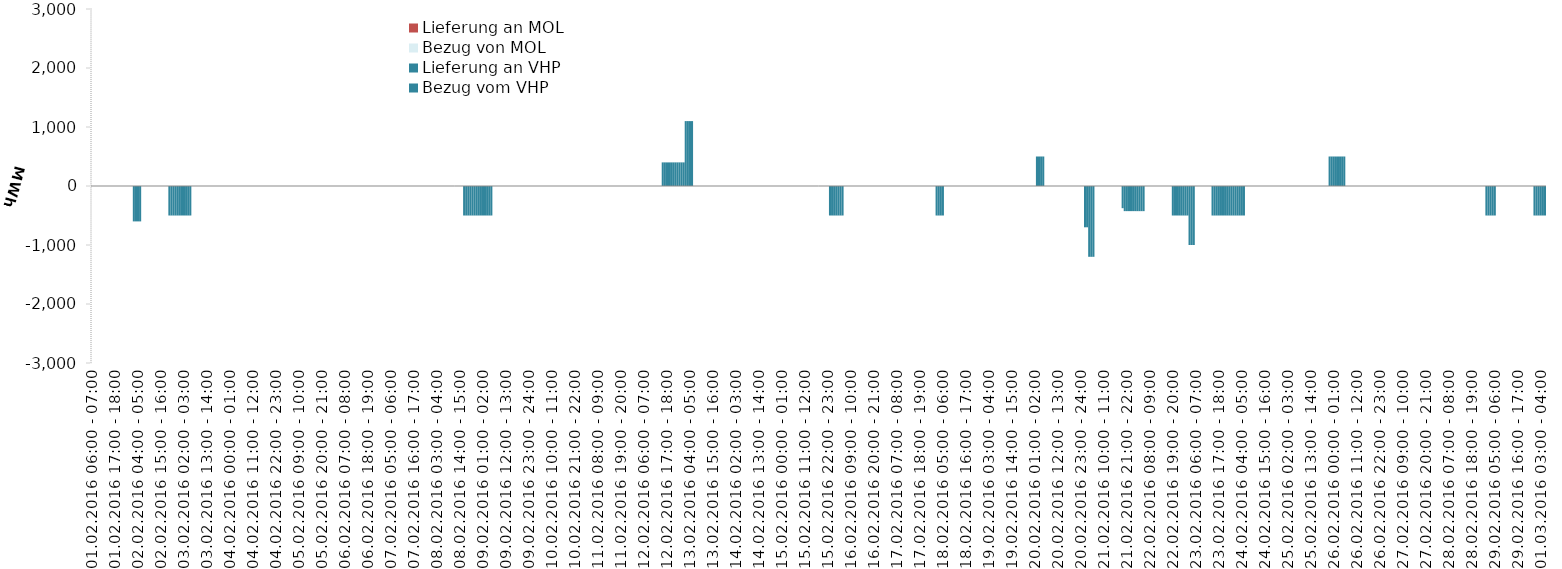
| Category | Bezug vom VHP | Lieferung an VHP | Bezug von MOL | Lieferung an MOL |
|---|---|---|---|---|
| 01.02.2016 06:00 - 07:00 | 0 | 0 | 0 | 0 |
| 01.02.2016 07:00 - 08:00 | 0 | 0 | 0 | 0 |
| 01.02.2016 08:00 - 09:00 | 0 | 0 | 0 | 0 |
| 01.02.2016 09:00 - 10:00 | 0 | 0 | 0 | 0 |
| 01.02.2016 10:00 - 11:00 | 0 | 0 | 0 | 0 |
| 01.02.2016 11:00 - 12:00 | 0 | 0 | 0 | 0 |
| 01.02.2016 12:00 - 13:00 | 0 | 0 | 0 | 0 |
| 01.02.2016 13:00 - 14:00 | 0 | 0 | 0 | 0 |
| 01.02.2016 14:00 - 15:00 | 0 | 0 | 0 | 0 |
| 01.02.2016 15:00 - 16:00 | 0 | 0 | 0 | 0 |
| 01.02.2016 16:00 - 17:00 | 0 | 0 | 0 | 0 |
| 01.02.2016 17:00 - 18:00 | 0 | 0 | 0 | 0 |
| 01.02.2016 18:00 - 19:00 | 0 | 0 | 0 | 0 |
| 01.02.2016 19:00 - 20:00 | 0 | 0 | 0 | 0 |
| 01.02.2016 20:00 - 21:00 | 0 | 0 | 0 | 0 |
| 01.02.2016 21:00 - 22:00 | 0 | 0 | 0 | 0 |
| 01.02.2016 22:00 - 23:00 | 0 | 0 | 0 | 0 |
| 01.02.2016 23:00 - 24:00 | 0 | 0 | 0 | 0 |
| 02.02.2016 00:00 - 01:00 | 0 | 0 | 0 | 0 |
| 02.02.2016 01:00 - 02:00 | 0 | 0 | 0 | 0 |
| 02.02.2016 02:00 - 03:00 | 0 | -600 | 0 | 0 |
| 02.02.2016 03:00 - 04:00 | 0 | -600 | 0 | 0 |
| 02.02.2016 04:00 - 05:00 | 0 | -600 | 0 | 0 |
| 02.02.2016 05:00 - 06:00 | 0 | -600 | 0 | 0 |
| 02.02.2016 06:00 - 07:00 | 0 | 0 | 0 | 0 |
| 02.02.2016 07:00 - 08:00 | 0 | 0 | 0 | 0 |
| 02.02.2016 08:00 - 09:00 | 0 | 0 | 0 | 0 |
| 02.02.2016 09:00 - 10:00 | 0 | 0 | 0 | 0 |
| 02.02.2016 10:00 - 11:00 | 0 | 0 | 0 | 0 |
| 02.02.2016 11:00 - 12:00 | 0 | 0 | 0 | 0 |
| 02.02.2016 12:00 - 13:00 | 0 | 0 | 0 | 0 |
| 02.02.2016 13:00 - 14:00 | 0 | 0 | 0 | 0 |
| 02.02.2016 14:00 - 15:00 | 0 | 0 | 0 | 0 |
| 02.02.2016 15:00 - 16:00 | 0 | 0 | 0 | 0 |
| 02.02.2016 16:00 - 17:00 | 0 | 0 | 0 | 0 |
| 02.02.2016 17:00 - 18:00 | 0 | 0 | 0 | 0 |
| 02.02.2016 18:00 - 19:00 | 0 | 0 | 0 | 0 |
| 02.02.2016 19:00 - 20:00 | 0 | -500 | 0 | 0 |
| 02.02.2016 20:00 - 21:00 | 0 | -500 | 0 | 0 |
| 02.02.2016 21:00 - 22:00 | 0 | -500 | 0 | 0 |
| 02.02.2016 22:00 - 23:00 | 0 | -500 | 0 | 0 |
| 02.02.2016 23:00 - 24:00 | 0 | -500 | 0 | 0 |
| 03.02.2016 00:00 - 01:00 | 0 | -500 | 0 | 0 |
| 03.02.2016 01:00 - 02:00 | 0 | -500 | 0 | 0 |
| 03.02.2016 02:00 - 03:00 | 0 | -500 | 0 | 0 |
| 03.02.2016 03:00 - 04:00 | 0 | -500 | 0 | 0 |
| 03.02.2016 04:00 - 05:00 | 0 | -500 | 0 | 0 |
| 03.02.2016 05:00 - 06:00 | 0 | -500 | 0 | 0 |
| 03.02.2016 06:00 - 07:00 | 0 | 0 | 0 | 0 |
| 03.02.2016 07:00 - 08:00 | 0 | 0 | 0 | 0 |
| 03.02.2016 08:00 - 09:00 | 0 | 0 | 0 | 0 |
| 03.02.2016 09:00 - 10:00 | 0 | 0 | 0 | 0 |
| 03.02.2016 10:00 - 11:00 | 0 | 0 | 0 | 0 |
| 03.02.2016 11:00 - 12:00 | 0 | 0 | 0 | 0 |
| 03.02.2016 12:00 - 13:00 | 0 | 0 | 0 | 0 |
| 03.02.2016 13:00 - 14:00 | 0 | 0 | 0 | 0 |
| 03.02.2016 14:00 - 15:00 | 0 | 0 | 0 | 0 |
| 03.02.2016 15:00 - 16:00 | 0 | 0 | 0 | 0 |
| 03.02.2016 16:00 - 17:00 | 0 | 0 | 0 | 0 |
| 03.02.2016 17:00 - 18:00 | 0 | 0 | 0 | 0 |
| 03.02.2016 18:00 - 19:00 | 0 | 0 | 0 | 0 |
| 03.02.2016 19:00 - 20:00 | 0 | 0 | 0 | 0 |
| 03.02.2016 20:00 - 21:00 | 0 | 0 | 0 | 0 |
| 03.02.2016 21:00 - 22:00 | 0 | 0 | 0 | 0 |
| 03.02.2016 22:00 - 23:00 | 0 | 0 | 0 | 0 |
| 03.02.2016 23:00 - 24:00 | 0 | 0 | 0 | 0 |
| 04.02.2016 00:00 - 01:00 | 0 | 0 | 0 | 0 |
| 04.02.2016 01:00 - 02:00 | 0 | 0 | 0 | 0 |
| 04.02.2016 02:00 - 03:00 | 0 | 0 | 0 | 0 |
| 04.02.2016 03:00 - 04:00 | 0 | 0 | 0 | 0 |
| 04.02.2016 04:00 - 05:00 | 0 | 0 | 0 | 0 |
| 04.02.2016 05:00 - 06:00 | 0 | 0 | 0 | 0 |
| 04.02.2016 06:00 - 07:00 | 0 | 0 | 0 | 0 |
| 04.02.2016 07:00 - 08:00 | 0 | 0 | 0 | 0 |
| 04.02.2016 08:00 - 09:00 | 0 | 0 | 0 | 0 |
| 04.02.2016 09:00 - 10:00 | 0 | 0 | 0 | 0 |
| 04.02.2016 10:00 - 11:00 | 0 | 0 | 0 | 0 |
| 04.02.2016 11:00 - 12:00 | 0 | 0 | 0 | 0 |
| 04.02.2016 12:00 - 13:00 | 0 | 0 | 0 | 0 |
| 04.02.2016 13:00 - 14:00 | 0 | 0 | 0 | 0 |
| 04.02.2016 14:00 - 15:00 | 0 | 0 | 0 | 0 |
| 04.02.2016 15:00 - 16:00 | 0 | 0 | 0 | 0 |
| 04.02.2016 16:00 - 17:00 | 0 | 0 | 0 | 0 |
| 04.02.2016 17:00 - 18:00 | 0 | 0 | 0 | 0 |
| 04.02.2016 18:00 - 19:00 | 0 | 0 | 0 | 0 |
| 04.02.2016 19:00 - 20:00 | 0 | 0 | 0 | 0 |
| 04.02.2016 20:00 - 21:00 | 0 | 0 | 0 | 0 |
| 04.02.2016 21:00 - 22:00 | 0 | 0 | 0 | 0 |
| 04.02.2016 22:00 - 23:00 | 0 | 0 | 0 | 0 |
| 04.02.2016 23:00 - 24:00 | 0 | 0 | 0 | 0 |
| 05.02.2016 00:00 - 01:00 | 0 | 0 | 0 | 0 |
| 05.02.2016 01:00 - 02:00 | 0 | 0 | 0 | 0 |
| 05.02.2016 02:00 - 03:00 | 0 | 0 | 0 | 0 |
| 05.02.2016 03:00 - 04:00 | 0 | 0 | 0 | 0 |
| 05.02.2016 04:00 - 05:00 | 0 | 0 | 0 | 0 |
| 05.02.2016 05:00 - 06:00 | 0 | 0 | 0 | 0 |
| 05.02.2016 06:00 - 07:00 | 0 | 0 | 0 | 0 |
| 05.02.2016 07:00 - 08:00 | 0 | 0 | 0 | 0 |
| 05.02.2016 08:00 - 09:00 | 0 | 0 | 0 | 0 |
| 05.02.2016 09:00 - 10:00 | 0 | 0 | 0 | 0 |
| 05.02.2016 10:00 - 11:00 | 0 | 0 | 0 | 0 |
| 05.02.2016 11:00 - 12:00 | 0 | 0 | 0 | 0 |
| 05.02.2016 12:00 - 13:00 | 0 | 0 | 0 | 0 |
| 05.02.2016 13:00 - 14:00 | 0 | 0 | 0 | 0 |
| 05.02.2016 14:00 - 15:00 | 0 | 0 | 0 | 0 |
| 05.02.2016 15:00 - 16:00 | 0 | 0 | 0 | 0 |
| 05.02.2016 16:00 - 17:00 | 0 | 0 | 0 | 0 |
| 05.02.2016 17:00 - 18:00 | 0 | 0 | 0 | 0 |
| 05.02.2016 18:00 - 19:00 | 0 | 0 | 0 | 0 |
| 05.02.2016 19:00 - 20:00 | 0 | 0 | 0 | 0 |
| 05.02.2016 20:00 - 21:00 | 0 | 0 | 0 | 0 |
| 05.02.2016 21:00 - 22:00 | 0 | 0 | 0 | 0 |
| 05.02.2016 22:00 - 23:00 | 0 | 0 | 0 | 0 |
| 05.02.2016 23:00 - 24:00 | 0 | 0 | 0 | 0 |
| 06.02.2016 00:00 - 01:00 | 0 | 0 | 0 | 0 |
| 06.02.2016 01:00 - 02:00 | 0 | 0 | 0 | 0 |
| 06.02.2016 02:00 - 03:00 | 0 | 0 | 0 | 0 |
| 06.02.2016 03:00 - 04:00 | 0 | 0 | 0 | 0 |
| 06.02.2016 04:00 - 05:00 | 0 | 0 | 0 | 0 |
| 06.02.2016 05:00 - 06:00 | 0 | 0 | 0 | 0 |
| 06.02.2016 06:00 - 07:00 | 0 | 0 | 0 | 0 |
| 06.02.2016 07:00 - 08:00 | 0 | 0 | 0 | 0 |
| 06.02.2016 08:00 - 09:00 | 0 | 0 | 0 | 0 |
| 06.02.2016 09:00 - 10:00 | 0 | 0 | 0 | 0 |
| 06.02.2016 10:00 - 11:00 | 0 | 0 | 0 | 0 |
| 06.02.2016 11:00 - 12:00 | 0 | 0 | 0 | 0 |
| 06.02.2016 12:00 - 13:00 | 0 | 0 | 0 | 0 |
| 06.02.2016 13:00 - 14:00 | 0 | 0 | 0 | 0 |
| 06.02.2016 14:00 - 15:00 | 0 | 0 | 0 | 0 |
| 06.02.2016 15:00 - 16:00 | 0 | 0 | 0 | 0 |
| 06.02.2016 16:00 - 17:00 | 0 | 0 | 0 | 0 |
| 06.02.2016 17:00 - 18:00 | 0 | 0 | 0 | 0 |
| 06.02.2016 18:00 - 19:00 | 0 | 0 | 0 | 0 |
| 06.02.2016 19:00 - 20:00 | 0 | 0 | 0 | 0 |
| 06.02.2016 20:00 - 21:00 | 0 | 0 | 0 | 0 |
| 06.02.2016 21:00 - 22:00 | 0 | 0 | 0 | 0 |
| 06.02.2016 22:00 - 23:00 | 0 | 0 | 0 | 0 |
| 06.02.2016 23:00 - 24:00 | 0 | 0 | 0 | 0 |
| 07.02.2016 00:00 - 01:00 | 0 | 0 | 0 | 0 |
| 07.02.2016 01:00 - 02:00 | 0 | 0 | 0 | 0 |
| 07.02.2016 02:00 - 03:00 | 0 | 0 | 0 | 0 |
| 07.02.2016 03:00 - 04:00 | 0 | 0 | 0 | 0 |
| 07.02.2016 04:00 - 05:00 | 0 | 0 | 0 | 0 |
| 07.02.2016 05:00 - 06:00 | 0 | 0 | 0 | 0 |
| 07.02.2016 06:00 - 07:00 | 0 | 0 | 0 | 0 |
| 07.02.2016 07:00 - 08:00 | 0 | 0 | 0 | 0 |
| 07.02.2016 08:00 - 09:00 | 0 | 0 | 0 | 0 |
| 07.02.2016 09:00 - 10:00 | 0 | 0 | 0 | 0 |
| 07.02.2016 10:00 - 11:00 | 0 | 0 | 0 | 0 |
| 07.02.2016 11:00 - 12:00 | 0 | 0 | 0 | 0 |
| 07.02.2016 12:00 - 13:00 | 0 | 0 | 0 | 0 |
| 07.02.2016 13:00 - 14:00 | 0 | 0 | 0 | 0 |
| 07.02.2016 14:00 - 15:00 | 0 | 0 | 0 | 0 |
| 07.02.2016 15:00 - 16:00 | 0 | 0 | 0 | 0 |
| 07.02.2016 16:00 - 17:00 | 0 | 0 | 0 | 0 |
| 07.02.2016 17:00 - 18:00 | 0 | 0 | 0 | 0 |
| 07.02.2016 18:00 - 19:00 | 0 | 0 | 0 | 0 |
| 07.02.2016 19:00 - 20:00 | 0 | 0 | 0 | 0 |
| 07.02.2016 20:00 - 21:00 | 0 | 0 | 0 | 0 |
| 07.02.2016 21:00 - 22:00 | 0 | 0 | 0 | 0 |
| 07.02.2016 22:00 - 23:00 | 0 | 0 | 0 | 0 |
| 07.02.2016 23:00 - 24:00 | 0 | 0 | 0 | 0 |
| 08.02.2016 00:00 - 01:00 | 0 | 0 | 0 | 0 |
| 08.02.2016 01:00 - 02:00 | 0 | 0 | 0 | 0 |
| 08.02.2016 02:00 - 03:00 | 0 | 0 | 0 | 0 |
| 08.02.2016 03:00 - 04:00 | 0 | 0 | 0 | 0 |
| 08.02.2016 04:00 - 05:00 | 0 | 0 | 0 | 0 |
| 08.02.2016 05:00 - 06:00 | 0 | 0 | 0 | 0 |
| 08.02.2016 06:00 - 07:00 | 0 | 0 | 0 | 0 |
| 08.02.2016 07:00 - 08:00 | 0 | 0 | 0 | 0 |
| 08.02.2016 08:00 - 09:00 | 0 | 0 | 0 | 0 |
| 08.02.2016 09:00 - 10:00 | 0 | 0 | 0 | 0 |
| 08.02.2016 10:00 - 11:00 | 0 | 0 | 0 | 0 |
| 08.02.2016 11:00 - 12:00 | 0 | 0 | 0 | 0 |
| 08.02.2016 12:00 - 13:00 | 0 | 0 | 0 | 0 |
| 08.02.2016 13:00 - 14:00 | 0 | 0 | 0 | 0 |
| 08.02.2016 14:00 - 15:00 | 0 | 0 | 0 | 0 |
| 08.02.2016 15:00 - 16:00 | 0 | 0 | 0 | 0 |
| 08.02.2016 16:00 - 17:00 | 0 | -500 | 0 | 0 |
| 08.02.2016 17:00 - 18:00 | 0 | -500 | 0 | 0 |
| 08.02.2016 18:00 - 19:00 | 0 | -500 | 0 | 0 |
| 08.02.2016 19:00 - 20:00 | 0 | -500 | 0 | 0 |
| 08.02.2016 20:00 - 21:00 | 0 | -500 | 0 | 0 |
| 08.02.2016 21:00 - 22:00 | 0 | -500 | 0 | 0 |
| 08.02.2016 22:00 - 23:00 | 0 | -500 | 0 | 0 |
| 08.02.2016 23:00 - 24:00 | 0 | -500 | 0 | 0 |
| 09.02.2016 00:00 - 01:00 | 0 | -500 | 0 | 0 |
| 09.02.2016 01:00 - 02:00 | 0 | -500 | 0 | 0 |
| 09.02.2016 02:00 - 03:00 | 0 | -500 | 0 | 0 |
| 09.02.2016 03:00 - 04:00 | 0 | -500 | 0 | 0 |
| 09.02.2016 04:00 - 05:00 | 0 | -500 | 0 | 0 |
| 09.02.2016 05:00 - 06:00 | 0 | -500 | 0 | 0 |
| 09.02.2016 06:00 - 07:00 | 0 | 0 | 0 | 0 |
| 09.02.2016 07:00 - 08:00 | 0 | 0 | 0 | 0 |
| 09.02.2016 08:00 - 09:00 | 0 | 0 | 0 | 0 |
| 09.02.2016 09:00 - 10:00 | 0 | 0 | 0 | 0 |
| 09.02.2016 10:00 - 11:00 | 0 | 0 | 0 | 0 |
| 09.02.2016 11:00 - 12:00 | 0 | 0 | 0 | 0 |
| 09.02.2016 12:00 - 13:00 | 0 | 0 | 0 | 0 |
| 09.02.2016 13:00 - 14:00 | 0 | 0 | 0 | 0 |
| 09.02.2016 14:00 - 15:00 | 0 | 0 | 0 | 0 |
| 09.02.2016 15:00 - 16:00 | 0 | 0 | 0 | 0 |
| 09.02.2016 16:00 - 17:00 | 0 | 0 | 0 | 0 |
| 09.02.2016 17:00 - 18:00 | 0 | 0 | 0 | 0 |
| 09.02.2016 18:00 - 19:00 | 0 | 0 | 0 | 0 |
| 09.02.2016 19:00 - 20:00 | 0 | 0 | 0 | 0 |
| 09.02.2016 20:00 - 21:00 | 0 | 0 | 0 | 0 |
| 09.02.2016 21:00 - 22:00 | 0 | 0 | 0 | 0 |
| 09.02.2016 22:00 - 23:00 | 0 | 0 | 0 | 0 |
| 09.02.2016 23:00 - 24:00 | 0 | 0 | 0 | 0 |
| 10.02.2016 00:00 - 01:00 | 0 | 0 | 0 | 0 |
| 10.02.2016 01:00 - 02:00 | 0 | 0 | 0 | 0 |
| 10.02.2016 02:00 - 03:00 | 0 | 0 | 0 | 0 |
| 10.02.2016 03:00 - 04:00 | 0 | 0 | 0 | 0 |
| 10.02.2016 04:00 - 05:00 | 0 | 0 | 0 | 0 |
| 10.02.2016 05:00 - 06:00 | 0 | 0 | 0 | 0 |
| 10.02.2016 06:00 - 07:00 | 0 | 0 | 0 | 0 |
| 10.02.2016 07:00 - 08:00 | 0 | 0 | 0 | 0 |
| 10.02.2016 08:00 - 09:00 | 0 | 0 | 0 | 0 |
| 10.02.2016 09:00 - 10:00 | 0 | 0 | 0 | 0 |
| 10.02.2016 10:00 - 11:00 | 0 | 0 | 0 | 0 |
| 10.02.2016 11:00 - 12:00 | 0 | 0 | 0 | 0 |
| 10.02.2016 12:00 - 13:00 | 0 | 0 | 0 | 0 |
| 10.02.2016 13:00 - 14:00 | 0 | 0 | 0 | 0 |
| 10.02.2016 14:00 - 15:00 | 0 | 0 | 0 | 0 |
| 10.02.2016 15:00 - 16:00 | 0 | 0 | 0 | 0 |
| 10.02.2016 16:00 - 17:00 | 0 | 0 | 0 | 0 |
| 10.02.2016 17:00 - 18:00 | 0 | 0 | 0 | 0 |
| 10.02.2016 18:00 - 19:00 | 0 | 0 | 0 | 0 |
| 10.02.2016 19:00 - 20:00 | 0 | 0 | 0 | 0 |
| 10.02.2016 20:00 - 21:00 | 0 | 0 | 0 | 0 |
| 10.02.2016 21:00 - 22:00 | 0 | 0 | 0 | 0 |
| 10.02.2016 22:00 - 23:00 | 0 | 0 | 0 | 0 |
| 10.02.2016 23:00 - 24:00 | 0 | 0 | 0 | 0 |
| 11.02.2016 00:00 - 01:00 | 0 | 0 | 0 | 0 |
| 11.02.2016 01:00 - 02:00 | 0 | 0 | 0 | 0 |
| 11.02.2016 02:00 - 03:00 | 0 | 0 | 0 | 0 |
| 11.02.2016 03:00 - 04:00 | 0 | 0 | 0 | 0 |
| 11.02.2016 04:00 - 05:00 | 0 | 0 | 0 | 0 |
| 11.02.2016 05:00 - 06:00 | 0 | 0 | 0 | 0 |
| 11.02.2016 06:00 - 07:00 | 0 | 0 | 0 | 0 |
| 11.02.2016 07:00 - 08:00 | 0 | 0 | 0 | 0 |
| 11.02.2016 08:00 - 09:00 | 0 | 0 | 0 | 0 |
| 11.02.2016 09:00 - 10:00 | 0 | 0 | 0 | 0 |
| 11.02.2016 10:00 - 11:00 | 0 | 0 | 0 | 0 |
| 11.02.2016 11:00 - 12:00 | 0 | 0 | 0 | 0 |
| 11.02.2016 12:00 - 13:00 | 0 | 0 | 0 | 0 |
| 11.02.2016 13:00 - 14:00 | 0 | 0 | 0 | 0 |
| 11.02.2016 14:00 - 15:00 | 0 | 0 | 0 | 0 |
| 11.02.2016 15:00 - 16:00 | 0 | 0 | 0 | 0 |
| 11.02.2016 16:00 - 17:00 | 0 | 0 | 0 | 0 |
| 11.02.2016 17:00 - 18:00 | 0 | 0 | 0 | 0 |
| 11.02.2016 18:00 - 19:00 | 0 | 0 | 0 | 0 |
| 11.02.2016 19:00 - 20:00 | 0 | 0 | 0 | 0 |
| 11.02.2016 20:00 - 21:00 | 0 | 0 | 0 | 0 |
| 11.02.2016 21:00 - 22:00 | 0 | 0 | 0 | 0 |
| 11.02.2016 22:00 - 23:00 | 0 | 0 | 0 | 0 |
| 11.02.2016 23:00 - 24:00 | 0 | 0 | 0 | 0 |
| 12.02.2016 00:00 - 01:00 | 0 | 0 | 0 | 0 |
| 12.02.2016 01:00 - 02:00 | 0 | 0 | 0 | 0 |
| 12.02.2016 02:00 - 03:00 | 0 | 0 | 0 | 0 |
| 12.02.2016 03:00 - 04:00 | 0 | 0 | 0 | 0 |
| 12.02.2016 04:00 - 05:00 | 0 | 0 | 0 | 0 |
| 12.02.2016 05:00 - 06:00 | 0 | 0 | 0 | 0 |
| 12.02.2016 06:00 - 07:00 | 0 | 0 | 0 | 0 |
| 12.02.2016 07:00 - 08:00 | 0 | 0 | 0 | 0 |
| 12.02.2016 08:00 - 09:00 | 0 | 0 | 0 | 0 |
| 12.02.2016 09:00 - 10:00 | 0 | 0 | 0 | 0 |
| 12.02.2016 10:00 - 11:00 | 0 | 0 | 0 | 0 |
| 12.02.2016 11:00 - 12:00 | 0 | 0 | 0 | 0 |
| 12.02.2016 12:00 - 13:00 | 0 | 0 | 0 | 0 |
| 12.02.2016 13:00 - 14:00 | 0 | 0 | 0 | 0 |
| 12.02.2016 14:00 - 15:00 | 0 | 0 | 0 | 0 |
| 12.02.2016 15:00 - 16:00 | 400 | 0 | 0 | 0 |
| 12.02.2016 16:00 - 17:00 | 400 | 0 | 0 | 0 |
| 12.02.2016 17:00 - 18:00 | 400 | 0 | 0 | 0 |
| 12.02.2016 18:00 - 19:00 | 400 | 0 | 0 | 0 |
| 12.02.2016 19:00 - 20:00 | 400 | 0 | 0 | 0 |
| 12.02.2016 20:00 - 21:00 | 400 | 0 | 0 | 0 |
| 12.02.2016 21:00 - 22:00 | 400 | 0 | 0 | 0 |
| 12.02.2016 22:00 - 23:00 | 400 | 0 | 0 | 0 |
| 12.02.2016 23:00 - 24:00 | 400 | 0 | 0 | 0 |
| 13.02.2016 00:00 - 01:00 | 400 | 0 | 0 | 0 |
| 13.02.2016 01:00 - 02:00 | 400 | 0 | 0 | 0 |
| 13.02.2016 02:00 - 03:00 | 1100 | 0 | 0 | 0 |
| 13.02.2016 03:00 - 04:00 | 1100 | 0 | 0 | 0 |
| 13.02.2016 04:00 - 05:00 | 1100 | 0 | 0 | 0 |
| 13.02.2016 05:00 - 06:00 | 1100 | 0 | 0 | 0 |
| 13.02.2016 06:00 - 07:00 | 0 | 0 | 0 | 0 |
| 13.02.2016 07:00 - 08:00 | 0 | 0 | 0 | 0 |
| 13.02.2016 08:00 - 09:00 | 0 | 0 | 0 | 0 |
| 13.02.2016 09:00 - 10:00 | 0 | 0 | 0 | 0 |
| 13.02.2016 10:00 - 11:00 | 0 | 0 | 0 | 0 |
| 13.02.2016 11:00 - 12:00 | 0 | 0 | 0 | 0 |
| 13.02.2016 12:00 - 13:00 | 0 | 0 | 0 | 0 |
| 13.02.2016 13:00 - 14:00 | 0 | 0 | 0 | 0 |
| 13.02.2016 14:00 - 15:00 | 0 | 0 | 0 | 0 |
| 13.02.2016 15:00 - 16:00 | 0 | 0 | 0 | 0 |
| 13.02.2016 16:00 - 17:00 | 0 | 0 | 0 | 0 |
| 13.02.2016 17:00 - 18:00 | 0 | 0 | 0 | 0 |
| 13.02.2016 18:00 - 19:00 | 0 | 0 | 0 | 0 |
| 13.02.2016 19:00 - 20:00 | 0 | 0 | 0 | 0 |
| 13.02.2016 20:00 - 21:00 | 0 | 0 | 0 | 0 |
| 13.02.2016 21:00 - 22:00 | 0 | 0 | 0 | 0 |
| 13.02.2016 22:00 - 23:00 | 0 | 0 | 0 | 0 |
| 13.02.2016 23:00 - 24:00 | 0 | 0 | 0 | 0 |
| 14.02.2016 00:00 - 01:00 | 0 | 0 | 0 | 0 |
| 14.02.2016 01:00 - 02:00 | 0 | 0 | 0 | 0 |
| 14.02.2016 02:00 - 03:00 | 0 | 0 | 0 | 0 |
| 14.02.2016 03:00 - 04:00 | 0 | 0 | 0 | 0 |
| 14.02.2016 04:00 - 05:00 | 0 | 0 | 0 | 0 |
| 14.02.2016 05:00 - 06:00 | 0 | 0 | 0 | 0 |
| 14.02.2016 06:00 - 07:00 | 0 | 0 | 0 | 0 |
| 14.02.2016 07:00 - 08:00 | 0 | 0 | 0 | 0 |
| 14.02.2016 08:00 - 09:00 | 0 | 0 | 0 | 0 |
| 14.02.2016 09:00 - 10:00 | 0 | 0 | 0 | 0 |
| 14.02.2016 10:00 - 11:00 | 0 | 0 | 0 | 0 |
| 14.02.2016 11:00 - 12:00 | 0 | 0 | 0 | 0 |
| 14.02.2016 12:00 - 13:00 | 0 | 0 | 0 | 0 |
| 14.02.2016 13:00 - 14:00 | 0 | 0 | 0 | 0 |
| 14.02.2016 14:00 - 15:00 | 0 | 0 | 0 | 0 |
| 14.02.2016 15:00 - 16:00 | 0 | 0 | 0 | 0 |
| 14.02.2016 16:00 - 17:00 | 0 | 0 | 0 | 0 |
| 14.02.2016 17:00 - 18:00 | 0 | 0 | 0 | 0 |
| 14.02.2016 18:00 - 19:00 | 0 | 0 | 0 | 0 |
| 14.02.2016 19:00 - 20:00 | 0 | 0 | 0 | 0 |
| 14.02.2016 20:00 - 21:00 | 0 | 0 | 0 | 0 |
| 14.02.2016 21:00 - 22:00 | 0 | 0 | 0 | 0 |
| 14.02.2016 22:00 - 23:00 | 0 | 0 | 0 | 0 |
| 14.02.2016 23:00 - 24:00 | 0 | 0 | 0 | 0 |
| 15.02.2016 00:00 - 01:00 | 0 | 0 | 0 | 0 |
| 15.02.2016 01:00 - 02:00 | 0 | 0 | 0 | 0 |
| 15.02.2016 02:00 - 03:00 | 0 | 0 | 0 | 0 |
| 15.02.2016 03:00 - 04:00 | 0 | 0 | 0 | 0 |
| 15.02.2016 04:00 - 05:00 | 0 | 0 | 0 | 0 |
| 15.02.2016 05:00 - 06:00 | 0 | 0 | 0 | 0 |
| 15.02.2016 06:00 - 07:00 | 0 | 0 | 0 | 0 |
| 15.02.2016 07:00 - 08:00 | 0 | 0 | 0 | 0 |
| 15.02.2016 08:00 - 09:00 | 0 | 0 | 0 | 0 |
| 15.02.2016 09:00 - 10:00 | 0 | 0 | 0 | 0 |
| 15.02.2016 10:00 - 11:00 | 0 | 0 | 0 | 0 |
| 15.02.2016 11:00 - 12:00 | 0 | 0 | 0 | 0 |
| 15.02.2016 12:00 - 13:00 | 0 | 0 | 0 | 0 |
| 15.02.2016 13:00 - 14:00 | 0 | 0 | 0 | 0 |
| 15.02.2016 14:00 - 15:00 | 0 | 0 | 0 | 0 |
| 15.02.2016 15:00 - 16:00 | 0 | 0 | 0 | 0 |
| 15.02.2016 16:00 - 17:00 | 0 | 0 | 0 | 0 |
| 15.02.2016 17:00 - 18:00 | 0 | 0 | 0 | 0 |
| 15.02.2016 18:00 - 19:00 | 0 | 0 | 0 | 0 |
| 15.02.2016 19:00 - 20:00 | 0 | 0 | 0 | 0 |
| 15.02.2016 20:00 - 21:00 | 0 | 0 | 0 | 0 |
| 15.02.2016 21:00 - 22:00 | 0 | 0 | 0 | 0 |
| 15.02.2016 22:00 - 23:00 | 0 | 0 | 0 | 0 |
| 15.02.2016 23:00 - 24:00 | 0 | -500 | 0 | 0 |
| 16.02.2016 00:00 - 01:00 | 0 | -500 | 0 | 0 |
| 16.02.2016 01:00 - 02:00 | 0 | -500 | 0 | 0 |
| 16.02.2016 02:00 - 03:00 | 0 | -500 | 0 | 0 |
| 16.02.2016 03:00 - 04:00 | 0 | -500 | 0 | 0 |
| 16.02.2016 04:00 - 05:00 | 0 | -500 | 0 | 0 |
| 16.02.2016 05:00 - 06:00 | 0 | -500 | 0 | 0 |
| 16.02.2016 06:00 - 07:00 | 0 | 0 | 0 | 0 |
| 16.02.2016 07:00 - 08:00 | 0 | 0 | 0 | 0 |
| 16.02.2016 08:00 - 09:00 | 0 | 0 | 0 | 0 |
| 16.02.2016 09:00 - 10:00 | 0 | 0 | 0 | 0 |
| 16.02.2016 10:00 - 11:00 | 0 | 0 | 0 | 0 |
| 16.02.2016 11:00 - 12:00 | 0 | 0 | 0 | 0 |
| 16.02.2016 12:00 - 13:00 | 0 | 0 | 0 | 0 |
| 16.02.2016 13:00 - 14:00 | 0 | 0 | 0 | 0 |
| 16.02.2016 14:00 - 15:00 | 0 | 0 | 0 | 0 |
| 16.02.2016 15:00 - 16:00 | 0 | 0 | 0 | 0 |
| 16.02.2016 16:00 - 17:00 | 0 | 0 | 0 | 0 |
| 16.02.2016 17:00 - 18:00 | 0 | 0 | 0 | 0 |
| 16.02.2016 18:00 - 19:00 | 0 | 0 | 0 | 0 |
| 16.02.2016 19:00 - 20:00 | 0 | 0 | 0 | 0 |
| 16.02.2016 20:00 - 21:00 | 0 | 0 | 0 | 0 |
| 16.02.2016 21:00 - 22:00 | 0 | 0 | 0 | 0 |
| 16.02.2016 22:00 - 23:00 | 0 | 0 | 0 | 0 |
| 16.02.2016 23:00 - 24:00 | 0 | 0 | 0 | 0 |
| 17.02.2016 00:00 - 01:00 | 0 | 0 | 0 | 0 |
| 17.02.2016 01:00 - 02:00 | 0 | 0 | 0 | 0 |
| 17.02.2016 02:00 - 03:00 | 0 | 0 | 0 | 0 |
| 17.02.2016 03:00 - 04:00 | 0 | 0 | 0 | 0 |
| 17.02.2016 04:00 - 05:00 | 0 | 0 | 0 | 0 |
| 17.02.2016 05:00 - 06:00 | 0 | 0 | 0 | 0 |
| 17.02.2016 06:00 - 07:00 | 0 | 0 | 0 | 0 |
| 17.02.2016 07:00 - 08:00 | 0 | 0 | 0 | 0 |
| 17.02.2016 08:00 - 09:00 | 0 | 0 | 0 | 0 |
| 17.02.2016 09:00 - 10:00 | 0 | 0 | 0 | 0 |
| 17.02.2016 10:00 - 11:00 | 0 | 0 | 0 | 0 |
| 17.02.2016 11:00 - 12:00 | 0 | 0 | 0 | 0 |
| 17.02.2016 12:00 - 13:00 | 0 | 0 | 0 | 0 |
| 17.02.2016 13:00 - 14:00 | 0 | 0 | 0 | 0 |
| 17.02.2016 14:00 - 15:00 | 0 | 0 | 0 | 0 |
| 17.02.2016 15:00 - 16:00 | 0 | 0 | 0 | 0 |
| 17.02.2016 16:00 - 17:00 | 0 | 0 | 0 | 0 |
| 17.02.2016 17:00 - 18:00 | 0 | 0 | 0 | 0 |
| 17.02.2016 18:00 - 19:00 | 0 | 0 | 0 | 0 |
| 17.02.2016 19:00 - 20:00 | 0 | 0 | 0 | 0 |
| 17.02.2016 20:00 - 21:00 | 0 | 0 | 0 | 0 |
| 17.02.2016 21:00 - 22:00 | 0 | 0 | 0 | 0 |
| 17.02.2016 22:00 - 23:00 | 0 | 0 | 0 | 0 |
| 17.02.2016 23:00 - 24:00 | 0 | 0 | 0 | 0 |
| 18.02.2016 00:00 - 01:00 | 0 | 0 | 0 | 0 |
| 18.02.2016 01:00 - 02:00 | 0 | 0 | 0 | 0 |
| 18.02.2016 02:00 - 03:00 | 0 | -500 | 0 | 0 |
| 18.02.2016 03:00 - 04:00 | 0 | -500 | 0 | 0 |
| 18.02.2016 04:00 - 05:00 | 0 | -500 | 0 | 0 |
| 18.02.2016 05:00 - 06:00 | 0 | -500 | 0 | 0 |
| 18.02.2016 06:00 - 07:00 | 0 | 0 | 0 | 0 |
| 18.02.2016 07:00 - 08:00 | 0 | 0 | 0 | 0 |
| 18.02.2016 08:00 - 09:00 | 0 | 0 | 0 | 0 |
| 18.02.2016 09:00 - 10:00 | 0 | 0 | 0 | 0 |
| 18.02.2016 10:00 - 11:00 | 0 | 0 | 0 | 0 |
| 18.02.2016 11:00 - 12:00 | 0 | 0 | 0 | 0 |
| 18.02.2016 12:00 - 13:00 | 0 | 0 | 0 | 0 |
| 18.02.2016 13:00 - 14:00 | 0 | 0 | 0 | 0 |
| 18.02.2016 14:00 - 15:00 | 0 | 0 | 0 | 0 |
| 18.02.2016 15:00 - 16:00 | 0 | 0 | 0 | 0 |
| 18.02.2016 16:00 - 17:00 | 0 | 0 | 0 | 0 |
| 18.02.2016 17:00 - 18:00 | 0 | 0 | 0 | 0 |
| 18.02.2016 18:00 - 19:00 | 0 | 0 | 0 | 0 |
| 18.02.2016 19:00 - 20:00 | 0 | 0 | 0 | 0 |
| 18.02.2016 20:00 - 21:00 | 0 | 0 | 0 | 0 |
| 18.02.2016 21:00 - 22:00 | 0 | 0 | 0 | 0 |
| 18.02.2016 22:00 - 23:00 | 0 | 0 | 0 | 0 |
| 18.02.2016 23:00 - 24:00 | 0 | 0 | 0 | 0 |
| 19.02.2016 00:00 - 01:00 | 0 | 0 | 0 | 0 |
| 19.02.2016 01:00 - 02:00 | 0 | 0 | 0 | 0 |
| 19.02.2016 02:00 - 03:00 | 0 | 0 | 0 | 0 |
| 19.02.2016 03:00 - 04:00 | 0 | 0 | 0 | 0 |
| 19.02.2016 04:00 - 05:00 | 0 | 0 | 0 | 0 |
| 19.02.2016 05:00 - 06:00 | 0 | 0 | 0 | 0 |
| 19.02.2016 06:00 - 07:00 | 0 | 0 | 0 | 0 |
| 19.02.2016 07:00 - 08:00 | 0 | 0 | 0 | 0 |
| 19.02.2016 08:00 - 09:00 | 0 | 0 | 0 | 0 |
| 19.02.2016 09:00 - 10:00 | 0 | 0 | 0 | 0 |
| 19.02.2016 10:00 - 11:00 | 0 | 0 | 0 | 0 |
| 19.02.2016 11:00 - 12:00 | 0 | 0 | 0 | 0 |
| 19.02.2016 12:00 - 13:00 | 0 | 0 | 0 | 0 |
| 19.02.2016 13:00 - 14:00 | 0 | 0 | 0 | 0 |
| 19.02.2016 14:00 - 15:00 | 0 | 0 | 0 | 0 |
| 19.02.2016 15:00 - 16:00 | 0 | 0 | 0 | 0 |
| 19.02.2016 16:00 - 17:00 | 0 | 0 | 0 | 0 |
| 19.02.2016 17:00 - 18:00 | 0 | 0 | 0 | 0 |
| 19.02.2016 18:00 - 19:00 | 0 | 0 | 0 | 0 |
| 19.02.2016 19:00 - 20:00 | 0 | 0 | 0 | 0 |
| 19.02.2016 20:00 - 21:00 | 0 | 0 | 0 | 0 |
| 19.02.2016 21:00 - 22:00 | 0 | 0 | 0 | 0 |
| 19.02.2016 22:00 - 23:00 | 0 | 0 | 0 | 0 |
| 19.02.2016 23:00 - 24:00 | 0 | 0 | 0 | 0 |
| 20.02.2016 00:00 - 01:00 | 0 | 0 | 0 | 0 |
| 20.02.2016 01:00 - 02:00 | 0 | 0 | 0 | 0 |
| 20.02.2016 02:00 - 03:00 | 500 | 0 | 0 | 0 |
| 20.02.2016 03:00 - 04:00 | 500 | 0 | 0 | 0 |
| 20.02.2016 04:00 - 05:00 | 500 | 0 | 0 | 0 |
| 20.02.2016 05:00 - 06:00 | 500 | 0 | 0 | 0 |
| 20.02.2016 06:00 - 07:00 | 0 | 0 | 0 | 0 |
| 20.02.2016 07:00 - 08:00 | 0 | 0 | 0 | 0 |
| 20.02.2016 08:00 - 09:00 | 0 | 0 | 0 | 0 |
| 20.02.2016 09:00 - 10:00 | 0 | 0 | 0 | 0 |
| 20.02.2016 10:00 - 11:00 | 0 | 0 | 0 | 0 |
| 20.02.2016 11:00 - 12:00 | 0 | 0 | 0 | 0 |
| 20.02.2016 12:00 - 13:00 | 0 | 0 | 0 | 0 |
| 20.02.2016 13:00 - 14:00 | 0 | 0 | 0 | 0 |
| 20.02.2016 14:00 - 15:00 | 0 | 0 | 0 | 0 |
| 20.02.2016 15:00 - 16:00 | 0 | 0 | 0 | 0 |
| 20.02.2016 16:00 - 17:00 | 0 | 0 | 0 | 0 |
| 20.02.2016 17:00 - 18:00 | 0 | 0 | 0 | 0 |
| 20.02.2016 18:00 - 19:00 | 0 | 0 | 0 | 0 |
| 20.02.2016 19:00 - 20:00 | 0 | 0 | 0 | 0 |
| 20.02.2016 20:00 - 21:00 | 0 | 0 | 0 | 0 |
| 20.02.2016 21:00 - 22:00 | 0 | 0 | 0 | 0 |
| 20.02.2016 22:00 - 23:00 | 0 | 0 | 0 | 0 |
| 20.02.2016 23:00 - 24:00 | 0 | 0 | 0 | 0 |
| 21.02.2016 00:00 - 01:00 | 0 | 0 | 0 | 0 |
| 21.02.2016 01:00 - 02:00 | 0 | -700 | 0 | 0 |
| 21.02.2016 02:00 - 03:00 | 0 | -700 | 0 | 0 |
| 21.02.2016 03:00 - 04:00 | 0 | -1200 | 0 | 0 |
| 21.02.2016 04:00 - 05:00 | 0 | -1200 | 0 | 0 |
| 21.02.2016 05:00 - 06:00 | 0 | -1200 | 0 | 0 |
| 21.02.2016 06:00 - 07:00 | 0 | 0 | 0 | 0 |
| 21.02.2016 07:00 - 08:00 | 0 | 0 | 0 | 0 |
| 21.02.2016 08:00 - 09:00 | 0 | 0 | 0 | 0 |
| 21.02.2016 09:00 - 10:00 | 0 | 0 | 0 | 0 |
| 21.02.2016 10:00 - 11:00 | 0 | 0 | 0 | 0 |
| 21.02.2016 11:00 - 12:00 | 0 | 0 | 0 | 0 |
| 21.02.2016 12:00 - 13:00 | 0 | 0 | 0 | 0 |
| 21.02.2016 13:00 - 14:00 | 0 | 0 | 0 | 0 |
| 21.02.2016 14:00 - 15:00 | 0 | 0 | 0 | 0 |
| 21.02.2016 15:00 - 16:00 | 0 | 0 | 0 | 0 |
| 21.02.2016 16:00 - 17:00 | 0 | 0 | 0 | 0 |
| 21.02.2016 17:00 - 18:00 | 0 | 0 | 0 | 0 |
| 21.02.2016 18:00 - 19:00 | 0 | 0 | 0 | 0 |
| 21.02.2016 19:00 - 20:00 | 0 | -376 | 0 | 0 |
| 21.02.2016 20:00 - 21:00 | 0 | -426 | 0 | 0 |
| 21.02.2016 21:00 - 22:00 | 0 | -426 | 0 | 0 |
| 21.02.2016 22:00 - 23:00 | 0 | -426 | 0 | 0 |
| 21.02.2016 23:00 - 24:00 | 0 | -426 | 0 | 0 |
| 22.02.2016 00:00 - 01:00 | 0 | -426 | 0 | 0 |
| 22.02.2016 01:00 - 02:00 | 0 | -426 | 0 | 0 |
| 22.02.2016 02:00 - 03:00 | 0 | -426 | 0 | 0 |
| 22.02.2016 03:00 - 04:00 | 0 | -426 | 0 | 0 |
| 22.02.2016 04:00 - 05:00 | 0 | -426 | 0 | 0 |
| 22.02.2016 05:00 - 06:00 | 0 | -426 | 0 | 0 |
| 22.02.2016 06:00 - 07:00 | 0 | 0 | 0 | 0 |
| 22.02.2016 07:00 - 08:00 | 0 | 0 | 0 | 0 |
| 22.02.2016 08:00 - 09:00 | 0 | 0 | 0 | 0 |
| 22.02.2016 09:00 - 10:00 | 0 | 0 | 0 | 0 |
| 22.02.2016 10:00 - 11:00 | 0 | 0 | 0 | 0 |
| 22.02.2016 11:00 - 12:00 | 0 | 0 | 0 | 0 |
| 22.02.2016 12:00 - 13:00 | 0 | 0 | 0 | 0 |
| 22.02.2016 13:00 - 14:00 | 0 | 0 | 0 | 0 |
| 22.02.2016 14:00 - 15:00 | 0 | 0 | 0 | 0 |
| 22.02.2016 15:00 - 16:00 | 0 | 0 | 0 | 0 |
| 22.02.2016 16:00 - 17:00 | 0 | 0 | 0 | 0 |
| 22.02.2016 17:00 - 18:00 | 0 | 0 | 0 | 0 |
| 22.02.2016 18:00 - 19:00 | 0 | 0 | 0 | 0 |
| 22.02.2016 19:00 - 20:00 | 0 | -500 | 0 | 0 |
| 22.02.2016 20:00 - 21:00 | 0 | -500 | 0 | 0 |
| 22.02.2016 21:00 - 22:00 | 0 | -500 | 0 | 0 |
| 22.02.2016 22:00 - 23:00 | 0 | -500 | 0 | 0 |
| 22.02.2016 23:00 - 24:00 | 0 | -500 | 0 | 0 |
| 23.02.2016 00:00 - 01:00 | 0 | -500 | 0 | 0 |
| 23.02.2016 01:00 - 02:00 | 0 | -500 | 0 | 0 |
| 23.02.2016 02:00 - 03:00 | 0 | -500 | 0 | 0 |
| 23.02.2016 03:00 - 04:00 | 0 | -1000 | 0 | 0 |
| 23.02.2016 04:00 - 05:00 | 0 | -1000 | 0 | 0 |
| 23.02.2016 05:00 - 06:00 | 0 | -1000 | 0 | 0 |
| 23.02.2016 06:00 - 07:00 | 0 | 0 | 0 | 0 |
| 23.02.2016 07:00 - 08:00 | 0 | 0 | 0 | 0 |
| 23.02.2016 08:00 - 09:00 | 0 | 0 | 0 | 0 |
| 23.02.2016 09:00 - 10:00 | 0 | 0 | 0 | 0 |
| 23.02.2016 10:00 - 11:00 | 0 | 0 | 0 | 0 |
| 23.02.2016 11:00 - 12:00 | 0 | 0 | 0 | 0 |
| 23.02.2016 12:00 - 13:00 | 0 | 0 | 0 | 0 |
| 23.02.2016 13:00 - 14:00 | 0 | 0 | 0 | 0 |
| 23.02.2016 14:00 - 15:00 | 0 | -500 | 0 | 0 |
| 23.02.2016 15:00 - 16:00 | 0 | -500 | 0 | 0 |
| 23.02.2016 16:00 - 17:00 | 0 | -500 | 0 | 0 |
| 23.02.2016 17:00 - 18:00 | 0 | -500 | 0 | 0 |
| 23.02.2016 18:00 - 19:00 | 0 | -500 | 0 | 0 |
| 23.02.2016 19:00 - 20:00 | 0 | -500 | 0 | 0 |
| 23.02.2016 20:00 - 21:00 | 0 | -500 | 0 | 0 |
| 23.02.2016 21:00 - 22:00 | 0 | -500 | 0 | 0 |
| 23.02.2016 22:00 - 23:00 | 0 | -500 | 0 | 0 |
| 23.02.2016 23:00 - 24:00 | 0 | -500 | 0 | 0 |
| 24.02.2016 00:00 - 01:00 | 0 | -500 | 0 | 0 |
| 24.02.2016 01:00 - 02:00 | 0 | -500 | 0 | 0 |
| 24.02.2016 02:00 - 03:00 | 0 | -500 | 0 | 0 |
| 24.02.2016 03:00 - 04:00 | 0 | -500 | 0 | 0 |
| 24.02.2016 04:00 - 05:00 | 0 | -500 | 0 | 0 |
| 24.02.2016 05:00 - 06:00 | 0 | -500 | 0 | 0 |
| 24.02.2016 06:00 - 07:00 | 0 | 0 | 0 | 0 |
| 24.02.2016 07:00 - 08:00 | 0 | 0 | 0 | 0 |
| 24.02.2016 08:00 - 09:00 | 0 | 0 | 0 | 0 |
| 24.02.2016 09:00 - 10:00 | 0 | 0 | 0 | 0 |
| 24.02.2016 10:00 - 11:00 | 0 | 0 | 0 | 0 |
| 24.02.2016 11:00 - 12:00 | 0 | 0 | 0 | 0 |
| 24.02.2016 12:00 - 13:00 | 0 | 0 | 0 | 0 |
| 24.02.2016 13:00 - 14:00 | 0 | 0 | 0 | 0 |
| 24.02.2016 14:00 - 15:00 | 0 | 0 | 0 | 0 |
| 24.02.2016 15:00 - 16:00 | 0 | 0 | 0 | 0 |
| 24.02.2016 16:00 - 17:00 | 0 | 0 | 0 | 0 |
| 24.02.2016 17:00 - 18:00 | 0 | 0 | 0 | 0 |
| 24.02.2016 18:00 - 19:00 | 0 | 0 | 0 | 0 |
| 24.02.2016 19:00 - 20:00 | 0 | 0 | 0 | 0 |
| 24.02.2016 20:00 - 21:00 | 0 | 0 | 0 | 0 |
| 24.02.2016 21:00 - 22:00 | 0 | 0 | 0 | 0 |
| 24.02.2016 22:00 - 23:00 | 0 | 0 | 0 | 0 |
| 24.02.2016 23:00 - 24:00 | 0 | 0 | 0 | 0 |
| 25.02.2016 00:00 - 01:00 | 0 | 0 | 0 | 0 |
| 25.02.2016 01:00 - 02:00 | 0 | 0 | 0 | 0 |
| 25.02.2016 02:00 - 03:00 | 0 | 0 | 0 | 0 |
| 25.02.2016 03:00 - 04:00 | 0 | 0 | 0 | 0 |
| 25.02.2016 04:00 - 05:00 | 0 | 0 | 0 | 0 |
| 25.02.2016 05:00 - 06:00 | 0 | 0 | 0 | 0 |
| 25.02.2016 06:00 - 07:00 | 0 | 0 | 0 | 0 |
| 25.02.2016 07:00 - 08:00 | 0 | 0 | 0 | 0 |
| 25.02.2016 08:00 - 09:00 | 0 | 0 | 0 | 0 |
| 25.02.2016 09:00 - 10:00 | 0 | 0 | 0 | 0 |
| 25.02.2016 10:00 - 11:00 | 0 | 0 | 0 | 0 |
| 25.02.2016 11:00 - 12:00 | 0 | 0 | 0 | 0 |
| 25.02.2016 12:00 - 13:00 | 0 | 0 | 0 | 0 |
| 25.02.2016 13:00 - 14:00 | 0 | 0 | 0 | 0 |
| 25.02.2016 14:00 - 15:00 | 0 | 0 | 0 | 0 |
| 25.02.2016 15:00 - 16:00 | 0 | 0 | 0 | 0 |
| 25.02.2016 16:00 - 17:00 | 0 | 0 | 0 | 0 |
| 25.02.2016 17:00 - 18:00 | 0 | 0 | 0 | 0 |
| 25.02.2016 18:00 - 19:00 | 0 | 0 | 0 | 0 |
| 25.02.2016 19:00 - 20:00 | 0 | 0 | 0 | 0 |
| 25.02.2016 20:00 - 21:00 | 0 | 0 | 0 | 0 |
| 25.02.2016 21:00 - 22:00 | 0 | 0 | 0 | 0 |
| 25.02.2016 22:00 - 23:00 | 500 | 0 | 0 | 0 |
| 25.02.2016 23:00 - 24:00 | 500 | 0 | 0 | 0 |
| 26.02.2016 00:00 - 01:00 | 500 | 0 | 0 | 0 |
| 26.02.2016 01:00 - 02:00 | 500 | 0 | 0 | 0 |
| 26.02.2016 02:00 - 03:00 | 500 | 0 | 0 | 0 |
| 26.02.2016 03:00 - 04:00 | 500 | 0 | 0 | 0 |
| 26.02.2016 04:00 - 05:00 | 500 | 0 | 0 | 0 |
| 26.02.2016 05:00 - 06:00 | 500 | 0 | 0 | 0 |
| 26.02.2016 06:00 - 07:00 | 0 | 0 | 0 | 0 |
| 26.02.2016 07:00 - 08:00 | 0 | 0 | 0 | 0 |
| 26.02.2016 08:00 - 09:00 | 0 | 0 | 0 | 0 |
| 26.02.2016 09:00 - 10:00 | 0 | 0 | 0 | 0 |
| 26.02.2016 10:00 - 11:00 | 0 | 0 | 0 | 0 |
| 26.02.2016 11:00 - 12:00 | 0 | 0 | 0 | 0 |
| 26.02.2016 12:00 - 13:00 | 0 | 0 | 0 | 0 |
| 26.02.2016 13:00 - 14:00 | 0 | 0 | 0 | 0 |
| 26.02.2016 14:00 - 15:00 | 0 | 0 | 0 | 0 |
| 26.02.2016 15:00 - 16:00 | 0 | 0 | 0 | 0 |
| 26.02.2016 16:00 - 17:00 | 0 | 0 | 0 | 0 |
| 26.02.2016 17:00 - 18:00 | 0 | 0 | 0 | 0 |
| 26.02.2016 18:00 - 19:00 | 0 | 0 | 0 | 0 |
| 26.02.2016 19:00 - 20:00 | 0 | 0 | 0 | 0 |
| 26.02.2016 20:00 - 21:00 | 0 | 0 | 0 | 0 |
| 26.02.2016 21:00 - 22:00 | 0 | 0 | 0 | 0 |
| 26.02.2016 22:00 - 23:00 | 0 | 0 | 0 | 0 |
| 26.02.2016 23:00 - 24:00 | 0 | 0 | 0 | 0 |
| 27.02.2016 00:00 - 01:00 | 0 | 0 | 0 | 0 |
| 27.02.2016 01:00 - 02:00 | 0 | 0 | 0 | 0 |
| 27.02.2016 02:00 - 03:00 | 0 | 0 | 0 | 0 |
| 27.02.2016 03:00 - 04:00 | 0 | 0 | 0 | 0 |
| 27.02.2016 04:00 - 05:00 | 0 | 0 | 0 | 0 |
| 27.02.2016 05:00 - 06:00 | 0 | 0 | 0 | 0 |
| 27.02.2016 06:00 - 07:00 | 0 | 0 | 0 | 0 |
| 27.02.2016 07:00 - 08:00 | 0 | 0 | 0 | 0 |
| 27.02.2016 08:00 - 09:00 | 0 | 0 | 0 | 0 |
| 27.02.2016 09:00 - 10:00 | 0 | 0 | 0 | 0 |
| 27.02.2016 10:00 - 11:00 | 0 | 0 | 0 | 0 |
| 27.02.2016 11:00 - 12:00 | 0 | 0 | 0 | 0 |
| 27.02.2016 12:00 - 13:00 | 0 | 0 | 0 | 0 |
| 27.02.2016 13:00 - 14:00 | 0 | 0 | 0 | 0 |
| 27.02.2016 14:00 - 15:00 | 0 | 0 | 0 | 0 |
| 27.02.2016 15:00 - 16:00 | 0 | 0 | 0 | 0 |
| 27.02.2016 16:00 - 17:00 | 0 | 0 | 0 | 0 |
| 27.02.2016 17:00 - 18:00 | 0 | 0 | 0 | 0 |
| 27.02.2016 18:00 - 19:00 | 0 | 0 | 0 | 0 |
| 27.02.2016 19:00 - 20:00 | 0 | 0 | 0 | 0 |
| 27.02.2016 20:00 - 21:00 | 0 | 0 | 0 | 0 |
| 27.02.2016 21:00 - 22:00 | 0 | 0 | 0 | 0 |
| 27.02.2016 22:00 - 23:00 | 0 | 0 | 0 | 0 |
| 27.02.2016 23:00 - 24:00 | 0 | 0 | 0 | 0 |
| 28.02.2016 00:00 - 01:00 | 0 | 0 | 0 | 0 |
| 28.02.2016 01:00 - 02:00 | 0 | 0 | 0 | 0 |
| 28.02.2016 02:00 - 03:00 | 0 | 0 | 0 | 0 |
| 28.02.2016 03:00 - 04:00 | 0 | 0 | 0 | 0 |
| 28.02.2016 04:00 - 05:00 | 0 | 0 | 0 | 0 |
| 28.02.2016 05:00 - 06:00 | 0 | 0 | 0 | 0 |
| 28.02.2016 06:00 - 07:00 | 0 | 0 | 0 | 0 |
| 28.02.2016 07:00 - 08:00 | 0 | 0 | 0 | 0 |
| 28.02.2016 08:00 - 09:00 | 0 | 0 | 0 | 0 |
| 28.02.2016 09:00 - 10:00 | 0 | 0 | 0 | 0 |
| 28.02.2016 10:00 - 11:00 | 0 | 0 | 0 | 0 |
| 28.02.2016 11:00 - 12:00 | 0 | 0 | 0 | 0 |
| 28.02.2016 12:00 - 13:00 | 0 | 0 | 0 | 0 |
| 28.02.2016 13:00 - 14:00 | 0 | 0 | 0 | 0 |
| 28.02.2016 14:00 - 15:00 | 0 | 0 | 0 | 0 |
| 28.02.2016 15:00 - 16:00 | 0 | 0 | 0 | 0 |
| 28.02.2016 16:00 - 17:00 | 0 | 0 | 0 | 0 |
| 28.02.2016 17:00 - 18:00 | 0 | 0 | 0 | 0 |
| 28.02.2016 18:00 - 19:00 | 0 | 0 | 0 | 0 |
| 28.02.2016 19:00 - 20:00 | 0 | 0 | 0 | 0 |
| 28.02.2016 20:00 - 21:00 | 0 | 0 | 0 | 0 |
| 28.02.2016 21:00 - 22:00 | 0 | 0 | 0 | 0 |
| 28.02.2016 22:00 - 23:00 | 0 | 0 | 0 | 0 |
| 28.02.2016 23:00 - 24:00 | 0 | 0 | 0 | 0 |
| 29.02.2016 00:00 - 01:00 | 0 | 0 | 0 | 0 |
| 29.02.2016 01:00 - 02:00 | 0 | -500 | 0 | 0 |
| 29.02.2016 02:00 - 03:00 | 0 | -500 | 0 | 0 |
| 29.02.2016 03:00 - 04:00 | 0 | -500 | 0 | 0 |
| 29.02.2016 04:00 - 05:00 | 0 | -500 | 0 | 0 |
| 29.02.2016 05:00 - 06:00 | 0 | -500 | 0 | 0 |
| 29.02.2016 06:00 - 07:00 | 0 | 0 | 0 | 0 |
| 29.02.2016 07:00 - 08:00 | 0 | 0 | 0 | 0 |
| 29.02.2016 08:00 - 09:00 | 0 | 0 | 0 | 0 |
| 29.02.2016 09:00 - 10:00 | 0 | 0 | 0 | 0 |
| 29.02.2016 10:00 - 11:00 | 0 | 0 | 0 | 0 |
| 29.02.2016 11:00 - 12:00 | 0 | 0 | 0 | 0 |
| 29.02.2016 12:00 - 13:00 | 0 | 0 | 0 | 0 |
| 29.02.2016 13:00 - 14:00 | 0 | 0 | 0 | 0 |
| 29.02.2016 14:00 - 15:00 | 0 | 0 | 0 | 0 |
| 29.02.2016 15:00 - 16:00 | 0 | 0 | 0 | 0 |
| 29.02.2016 16:00 - 17:00 | 0 | 0 | 0 | 0 |
| 29.02.2016 17:00 - 18:00 | 0 | 0 | 0 | 0 |
| 29.02.2016 18:00 - 19:00 | 0 | 0 | 0 | 0 |
| 29.02.2016 19:00 - 20:00 | 0 | 0 | 0 | 0 |
| 29.02.2016 20:00 - 21:00 | 0 | 0 | 0 | 0 |
| 29.02.2016 21:00 - 22:00 | 0 | 0 | 0 | 0 |
| 29.02.2016 22:00 - 23:00 | 0 | 0 | 0 | 0 |
| 29.02.2016 23:00 - 24:00 | 0 | 0 | 0 | 0 |
| 01.03.2016 00:00 - 01:00 | 0 | -500 | 0 | 0 |
| 01.03.2016 01:00 - 02:00 | 0 | -500 | 0 | 0 |
| 01.03.2016 02:00 - 03:00 | 0 | -500 | 0 | 0 |
| 01.03.2016 03:00 - 04:00 | 0 | -500 | 0 | 0 |
| 01.03.2016 04:00 - 05:00 | 0 | -500 | 0 | 0 |
| 01.03.2016 05:00 - 06:00 | 0 | -500 | 0 | 0 |